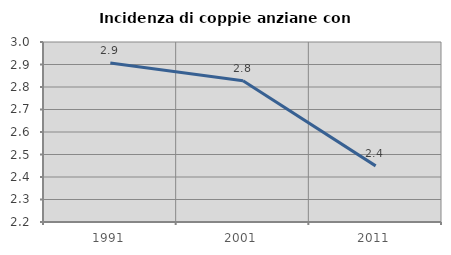
| Category | Incidenza di coppie anziane con figli |
|---|---|
| 1991.0 | 2.907 |
| 2001.0 | 2.827 |
| 2011.0 | 2.449 |